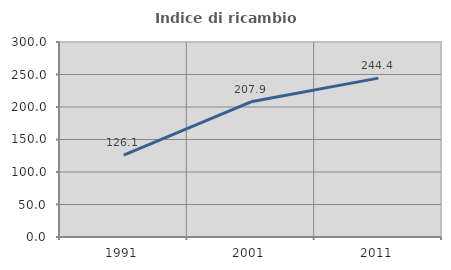
| Category | Indice di ricambio occupazionale  |
|---|---|
| 1991.0 | 126.07 |
| 2001.0 | 207.942 |
| 2011.0 | 244.444 |